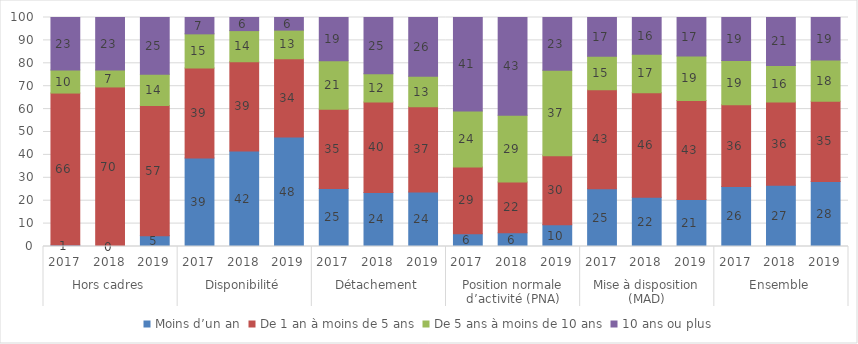
| Category | Moins d’un an | De 1 an à moins de 5 ans | De 5 ans à moins de 10 ans | 10 ans ou plus |
|---|---|---|---|---|
| 0 | 0.604 | 66.398 | 10.06 | 22.938 |
| 1 | 0 | 69.672 | 7.377 | 22.951 |
| 2 | 4.737 | 56.842 | 13.684 | 24.737 |
| 3 | 38.612 | 39.327 | 14.917 | 7.145 |
| 4 | 41.736 | 38.987 | 13.556 | 5.721 |
| 5 | 47.851 | 34.129 | 12.509 | 5.511 |
| 6 | 25.369 | 34.574 | 21.22 | 18.837 |
| 7 | 23.593 | 39.504 | 12.372 | 24.532 |
| 8 | 23.797 | 37.187 | 13.34 | 25.676 |
| 9 | 5.526 | 29.2 | 24.438 | 40.837 |
| 10 | 5.975 | 22.222 | 29.091 | 42.712 |
| 11 | 9.52 | 30.152 | 37.287 | 23.041 |
| 12 | 25.17 | 43.298 | 14.577 | 16.955 |
| 13 | 21.53 | 45.6 | 16.87 | 16 |
| 14 | 20.508 | 43.295 | 19.398 | 16.798 |
| 15 | 26.225 | 35.725 | 19.325 | 18.725 |
| 16 | 26.725 | 36.325 | 16.025 | 20.925 |
| 17 | 28.35 | 35.05 | 18.05 | 18.55 |